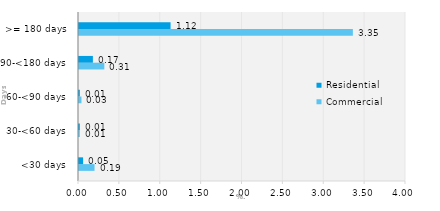
| Category | Commercial | Residential |
|---|---|---|
| <30 days | 0.19 | 0.05 |
| 30-<60 days | 0.01 | 0.01 |
| 60-<90 days | 0.03 | 0.01 |
| 90-<180 days | 0.31 | 0.17 |
| >= 180 days | 3.35 | 1.12 |